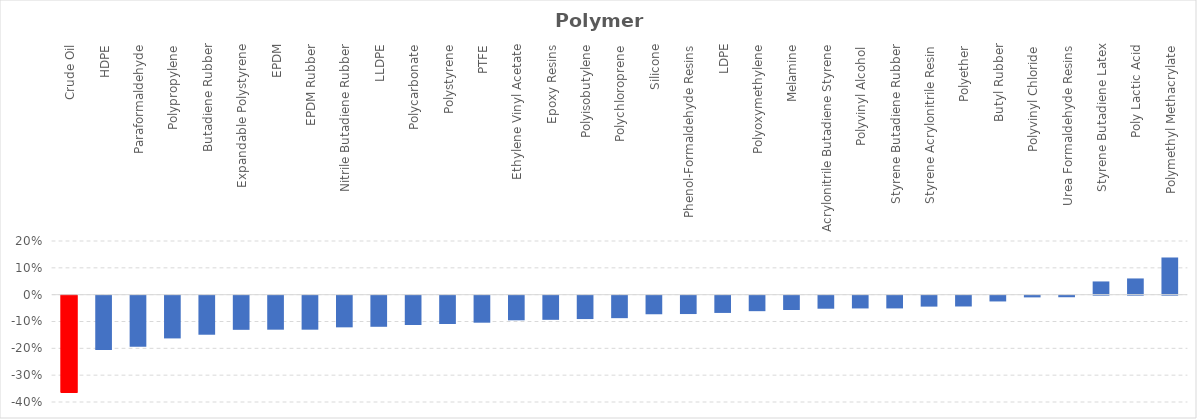
| Category | Series 0 |
|---|---|
| Crude Oil | -0.362 |
| HDPE | -0.203 |
| Paraformaldehyde | -0.19 |
| Polypropylene | -0.159 |
| Butadiene Rubber | -0.146 |
| Expandable Polystyrene | -0.127 |
| EPDM | -0.127 |
| EPDM Rubber | -0.127 |
| Nitrile Butadiene Rubber | -0.118 |
| LLDPE | -0.116 |
| Polycarbonate | -0.109 |
| Polystyrene | -0.106 |
| PTFE | -0.101 |
| Ethylene Vinyl Acetate | -0.092 |
| Epoxy Resins | -0.09 |
| Polyisobutylene | -0.087 |
| Polychloroprene | -0.084 |
| Silicone | -0.069 |
| Phenol-Formaldehyde Resins | -0.068 |
| LDPE | -0.064 |
| Polyoxymethylene | -0.058 |
| Melamine | -0.053 |
| Acrylonitrile Butadiene Styrene | -0.049 |
| Polyvinyl Alcohol | -0.048 |
| Styrene Butadiene Rubber | -0.048 |
| Styrene Acrylonitrile Resin | -0.041 |
| Polyether | -0.04 |
| Butyl Rubber | -0.022 |
| Polyvinyl Chloride | -0.006 |
| Urea Formaldehyde Resins | -0.006 |
| Styrene Butadiene Latex | 0.049 |
| Poly Lactic Acid | 0.06 |
| Polymethyl Methacrylate | 0.139 |